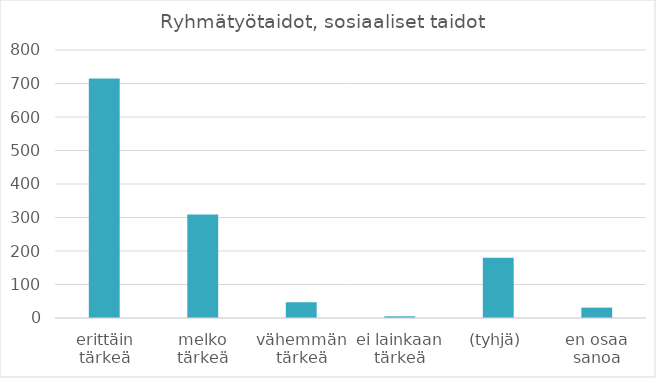
| Category | Summa |
|---|---|
| erittäin tärkeä | 715 |
| melko tärkeä | 309 |
| vähemmän tärkeä | 47 |
| ei lainkaan tärkeä | 5 |
| (tyhjä) | 180 |
| en osaa sanoa | 31 |